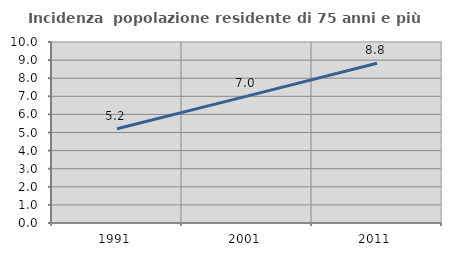
| Category | Incidenza  popolazione residente di 75 anni e più |
|---|---|
| 1991.0 | 5.211 |
| 2001.0 | 7.01 |
| 2011.0 | 8.824 |